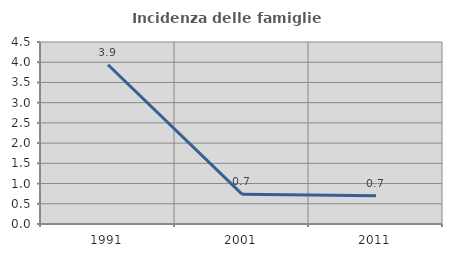
| Category | Incidenza delle famiglie numerose |
|---|---|
| 1991.0 | 3.937 |
| 2001.0 | 0.738 |
| 2011.0 | 0.699 |